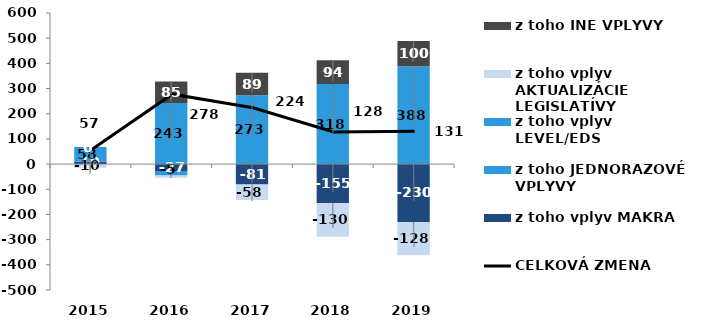
| Category | z toho vplyv MAKRA | z toho JEDNORAZOVÉ VPLYVY | z toho vplyv LEVEL/EDS | z toho vplyv AKTUALIZÁCIE LEGISLATÍVY | z toho INÉ VPLYVY |
|---|---|---|---|---|---|
| 2015.0 | 9.771 | 0 | 57.923 | -10.343 | 0 |
| 2016.0 | -27.415 | -17.74 | 243.024 | -4.883 | 84.673 |
| 2017.0 | -80.749 | 0 | 273.282 | -57.943 | 89.149 |
| 2018.0 | -154.905 | 0 | 318.132 | -129.625 | 94.232 |
| 2019.0 | -229.557 | 0 | 388.397 | -128.199 | 99.994 |